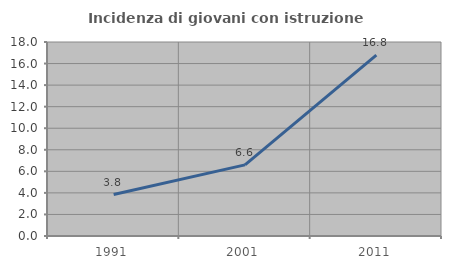
| Category | Incidenza di giovani con istruzione universitaria |
|---|---|
| 1991.0 | 3.846 |
| 2001.0 | 6.599 |
| 2011.0 | 16.774 |